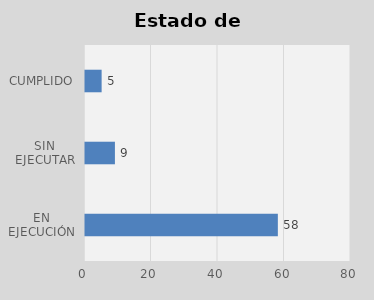
| Category | Total |
|---|---|
| EN EJECUCIÓN | 58 |
| SIN EJECUTAR | 9 |
| CUMPLIDO | 5 |